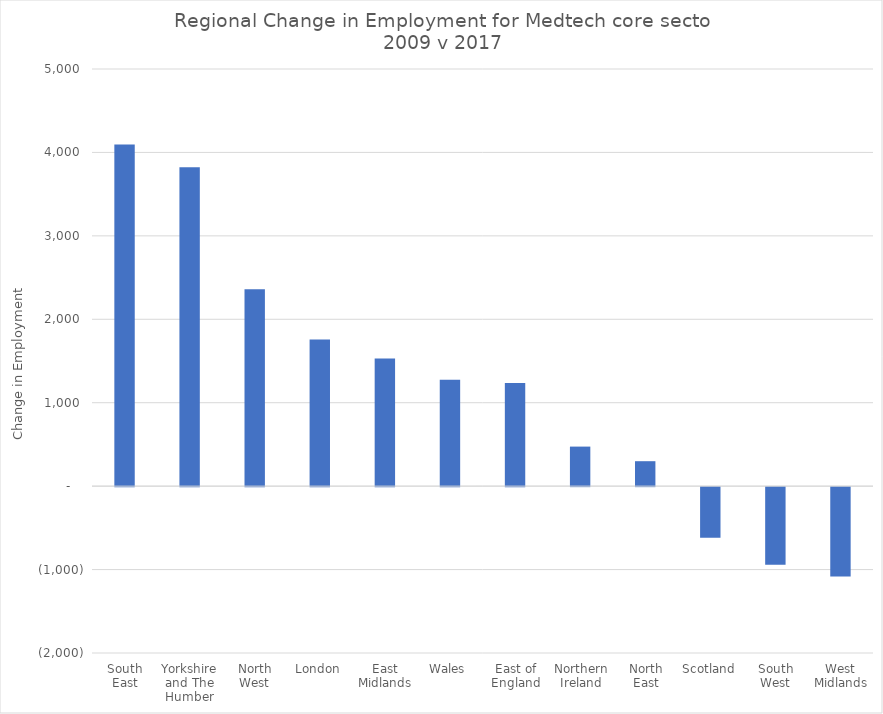
| Category | Change in Employment for Medtech core  2009 to 2017 |
|---|---|
| South East | 4095 |
| Yorkshire and The Humber | 3823 |
| North West | 2359 |
| London | 1757 |
| East Midlands | 1529 |
| Wales | 1274 |
| East of England | 1235 |
| Northern Ireland | 474 |
| North East | 299 |
| Scotland | -606 |
| South West | -930 |
| West Midlands | -1071 |